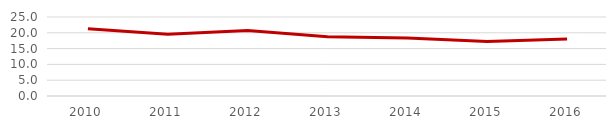
| Category | Proporción del Gasto Corriente del Gasto Total |
|---|---|
| 2010.0 | 21.245 |
| 2011.0 | 19.547 |
| 2012.0 | 20.748 |
| 2013.0 | 18.73 |
| 2014.0 | 18.374 |
| 2015.0 | 17.277 |
| 2016.0 | 18.005 |